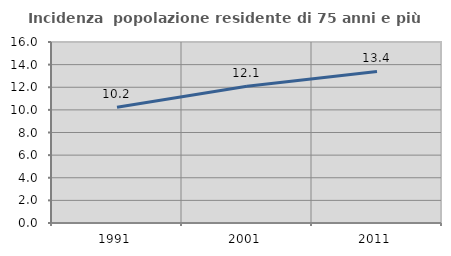
| Category | Incidenza  popolazione residente di 75 anni e più |
|---|---|
| 1991.0 | 10.24 |
| 2001.0 | 12.097 |
| 2011.0 | 13.392 |